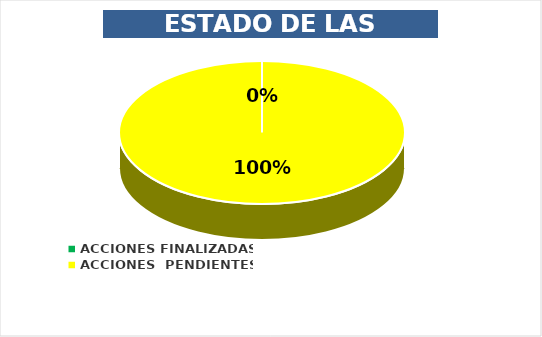
| Category | Series 0 |
|---|---|
| ACCIONES FINALIZADAS | 0 |
| ACCIONES  PENDIENTES | 38 |